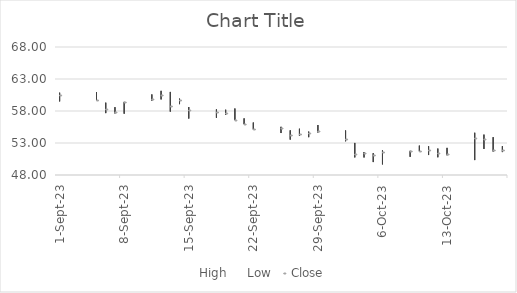
| Category | High | Low | Close |
|---|---|---|---|
| 2023-10-19 | 52.5 | 51.58 | 51.9 |
| 2023-10-18 | 53.91 | 51.66 | 51.84 |
| 2023-10-17 | 54.31 | 52.07 | 53.69 |
| 2023-10-16 | 54.6 | 50.33 | 53.72 |
| 2023-10-13 | 52.24 | 51.08 | 51.33 |
| 2023-10-12 | 52.13 | 50.77 | 51.51 |
| 2023-10-11 | 52.49 | 51.12 | 51.91 |
| 2023-10-10 | 52.59 | 51.71 | 51.78 |
| 2023-10-09 | 51.78 | 50.84 | 51.75 |
| 2023-10-06 | 51.85 | 49.66 | 51.52 |
| 2023-10-05 | 51.41 | 50.02 | 51.06 |
| 2023-10-04 | 51.58 | 50.74 | 51.41 |
| 2023-10-03 | 53.01 | 50.75 | 51.3 |
| 2023-10-02 | 54.96 | 53.27 | 53.55 |
| 2023-09-29 | 55.81 | 54.64 | 54.9 |
| 2023-09-28 | 54.78 | 53.91 | 54.55 |
| 2023-09-27 | 55.23 | 54.12 | 54.38 |
| 2023-09-26 | 54.98 | 53.53 | 54.2 |
| 2023-09-25 | 55.53 | 54.56 | 55.35 |
| 2023-09-22 | 56.2 | 55.12 | 55.15 |
| 2023-09-21 | 56.85 | 55.95 | 56.01 |
| 2023-09-20 | 58.39 | 56.63 | 56.67 |
| 2023-09-19 | 58.2 | 57.39 | 57.73 |
| 2023-09-18 | 58.25 | 56.94 | 57.86 |
| 2023-09-15 | 58.62 | 56.82 | 58.22 |
| 2023-09-14 | 59.93 | 59.07 | 59.76 |
| 2023-09-13 | 60.98 | 57.9 | 58.73 |
| 2023-09-12 | 61.15 | 59.81 | 60.52 |
| 2023-09-11 | 60.59 | 59.62 | 59.82 |
| 2023-09-08 | 59.43 | 57.58 | 59.33 |
| 2023-09-07 | 58.6 | 57.62 | 57.82 |
| 2023-09-06 | 59.3 | 57.67 | 58.27 |
| 2023-09-05 | 60.96 | 59.63 | 59.68 |
| 2023-09-01 | 60.86 | 59.5 | 60.5 |